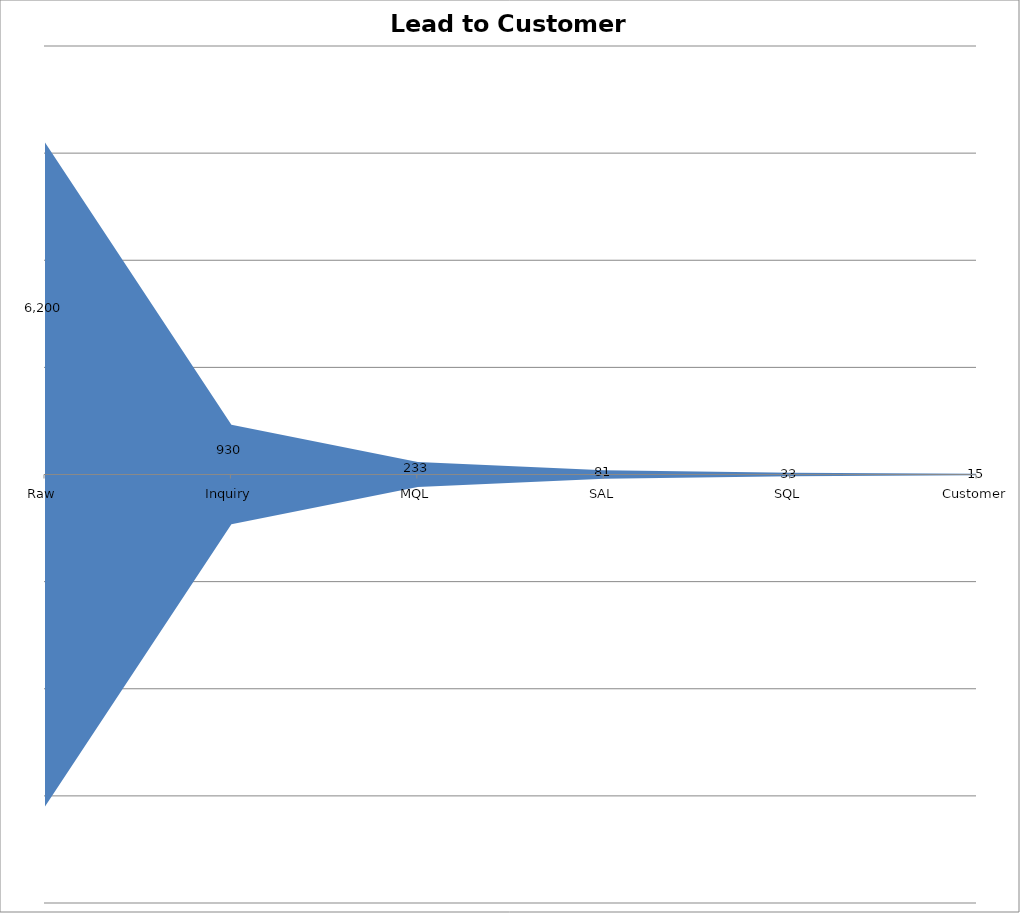
| Category | Series 0 | Series 1 |
|---|---|---|
| Raw | 6200 | -6200 |
| Inquiry | 930 | -930 |
| MQL | 232.5 | -232.5 |
| SAL | 81.375 | -81.375 |
| SQL | 32.55 | -32.55 |
| Customer | 14.648 | -14.648 |